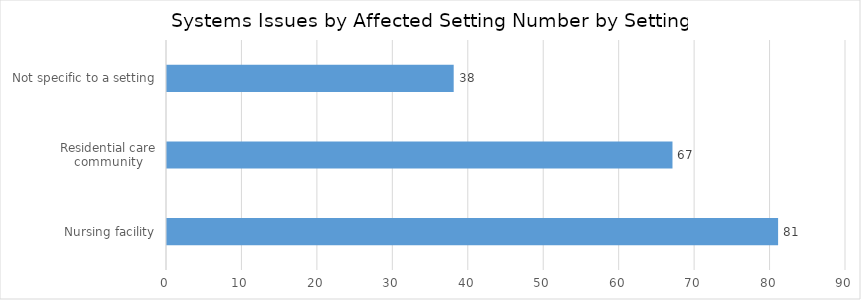
| Category | Systems issues by Affected setting |
|---|---|
| Nursing facility | 81 |
| Residential care community | 67 |
| Not specific to a setting | 38 |